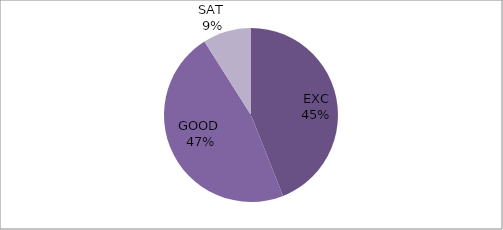
| Category | Series 0 |
|---|---|
| EXC | 44 |
| GOOD  | 47 |
| SAT  | 9 |